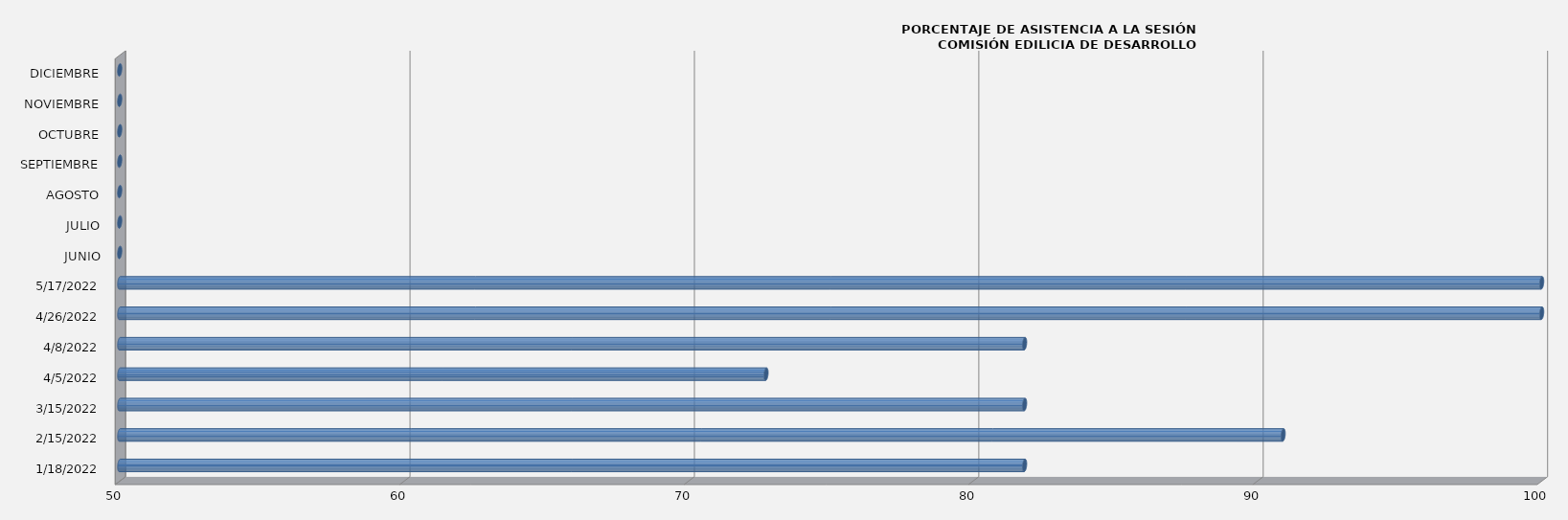
| Category | Series 0 |
|---|---|
| 18/01/2022 | 81.818 |
| 15/02/2022 | 90.909 |
| 15/03/2022 | 81.818 |
| 05/04/2022 | 72.727 |
| 08/04/2022 | 81.818 |
| 26/04/2022 | 100 |
| 17/05/2022 | 100 |
| JUNIO | 0 |
| JULIO | 0 |
| AGOSTO | 0 |
| SEPTIEMBRE | 0 |
| OCTUBRE | 0 |
| NOVIEMBRE | 0 |
| DICIEMBRE | 0 |